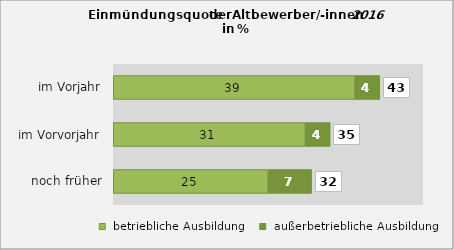
| Category |  betriebliche Ausbildung |  außerbetriebliche Ausbildung |
|---|---|---|
|  noch früher | 25 | 7 |
|  im Vorvorjahr | 31 | 4 |
|  im Vorjahr | 39 | 4 |